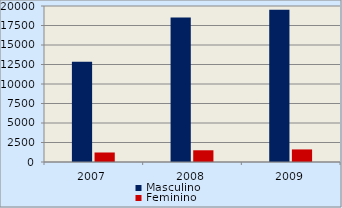
| Category | Masculino | Feminino |
|---|---|---|
| 2007.0 | 12855 | 1219 |
| 2008.0 | 18523 | 1503 |
| 2009.0 | 19533 | 1612 |